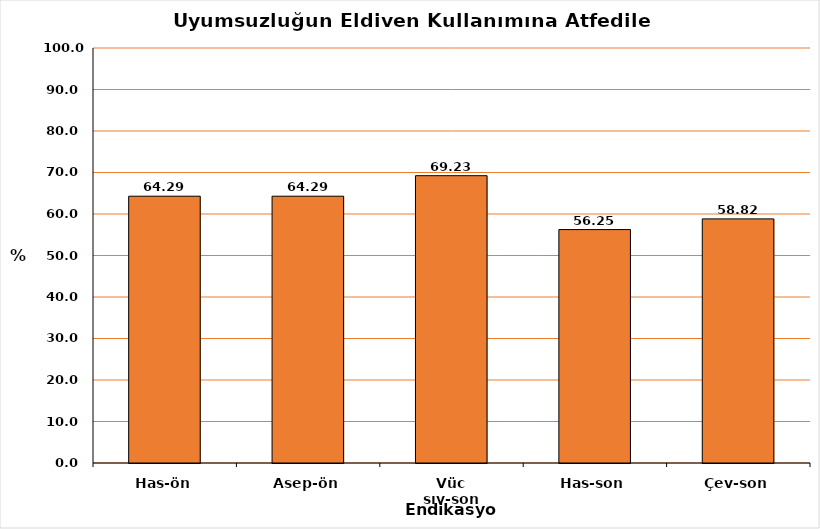
| Category | % |
|---|---|
| Has-ön | 64.286 |
| Asep-ön | 64.286 |
| Vüc sıv-son | 69.231 |
| Has-son | 56.25 |
| Çev-son | 58.824 |